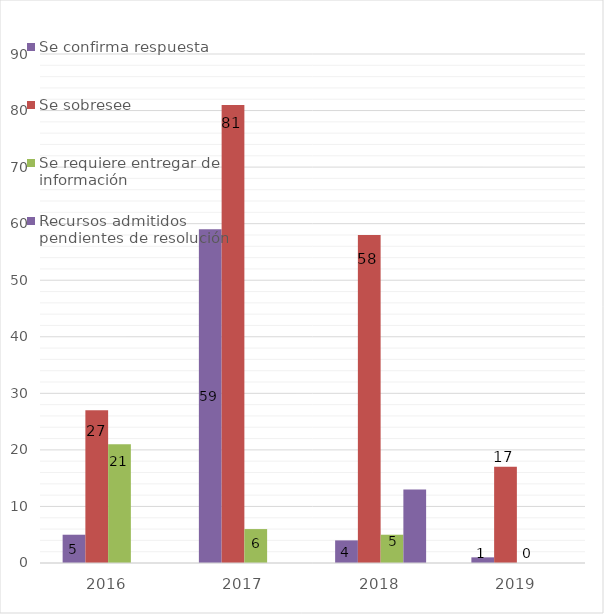
| Category | Se confirma respuesta | Se sobresee  | Se requiere entregar de información  | Recursos admitidos pendientes de resolución |
|---|---|---|---|---|
| 2016.0 | 5 | 27 | 21 | 0 |
| 2017.0 | 59 | 81 | 6 | 0 |
| 2018.0 | 4 | 58 | 5 | 13 |
| 2019.0 | 1 | 17 | 0 | 0 |